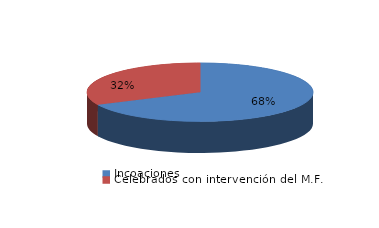
| Category | Series 0 |
|---|---|
| Incoaciones | 4134 |
| Celebrados con intervención del M.F. | 1950 |